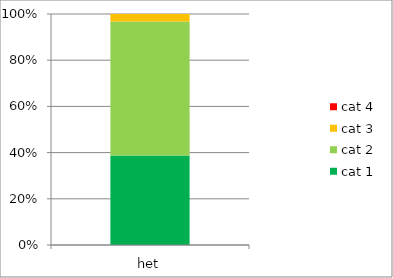
| Category | cat 1 | cat 2 | cat 3 | cat 4 |
|---|---|---|---|---|
| het | 12 | 18 | 1 | 0 |